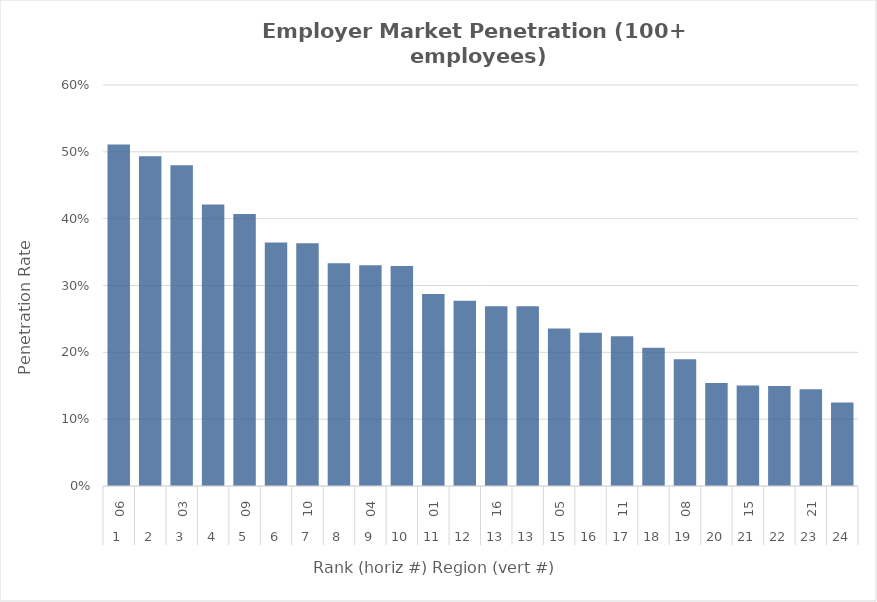
| Category | Rate |
|---|---|
| 0 | 0.511 |
| 1 | 0.494 |
| 2 | 0.48 |
| 3 | 0.421 |
| 4 | 0.407 |
| 5 | 0.364 |
| 6 | 0.363 |
| 7 | 0.333 |
| 8 | 0.33 |
| 9 | 0.329 |
| 10 | 0.287 |
| 11 | 0.277 |
| 12 | 0.269 |
| 13 | 0.269 |
| 14 | 0.236 |
| 15 | 0.229 |
| 16 | 0.224 |
| 17 | 0.207 |
| 18 | 0.19 |
| 19 | 0.154 |
| 20 | 0.151 |
| 21 | 0.15 |
| 22 | 0.145 |
| 23 | 0.125 |